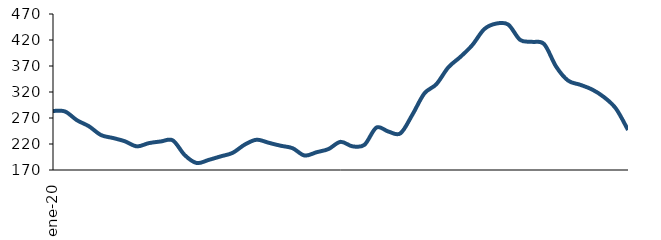
| Category | Series 0 |
|---|---|
| 2020-01-01 | 283.496 |
| 2020-02-01 | 282.571 |
| 2020-03-01 | 265.686 |
| 2020-04-01 | 254.092 |
| 2020-05-01 | 237.244 |
| 2020-06-01 | 231.555 |
| 2020-07-01 | 225.236 |
| 2020-08-01 | 215.435 |
| 2020-09-01 | 221.664 |
| 2020-10-01 | 224.87 |
| 2020-11-01 | 226.946 |
| 2020-12-01 | 198.561 |
| 2021-01-01 | 183.435 |
| 2021-02-01 | 189.419 |
| 2021-03-01 | 196.21 |
| 2021-04-01 | 203.011 |
| 2021-05-01 | 218.776 |
| 2021-06-01 | 228.209 |
| 2021-07-01 | 222.41 |
| 2021-08-01 | 216.706 |
| 2021-09-01 | 211.912 |
| 2021-10-01 | 197.858 |
| 2021-11-01 | 204.149 |
| 2021-12-01 | 210.311 |
| 2022-01-01 | 224.106 |
| 2022-02-01 | 215.528 |
| 2022-03-01 | 218.49 |
| 2022-04-01 | 251.637 |
| 2022-05-01 | 243.929 |
| 2022-06-01 | 240.483 |
| 2022-07-01 | 276.323 |
| 2022-08-01 | 317.225 |
| 2022-09-01 | 334.931 |
| 2022-10-01 | 367.369 |
| 2022-11-01 | 387.357 |
| 2022-12-01 | 410.168 |
| 2023-01-01 | 440.875 |
| 2023-02-01 | 451.547 |
| 2023-03-01 | 449.721 |
| 2023-04-01 | 420.133 |
| 2023-05-01 | 416.474 |
| 2023-06-01 | 412.054 |
| 2023-07-01 | 368.839 |
| 2023-08-01 | 341.912 |
| 2023-09-01 | 333.961 |
| 2023-10-01 | 324.864 |
| 2023-11-01 | 310.075 |
| 2023-12-01 | 287.878 |
| 2024-01-01 | 246.948 |